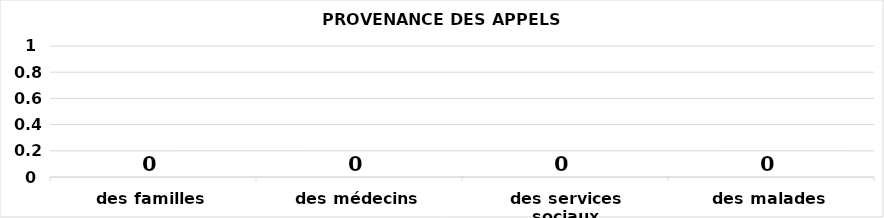
| Category | Series 0 |
|---|---|
| des familles | 0 |
| des médecins | 0 |
| des services sociaux | 0 |
| des malades | 0 |